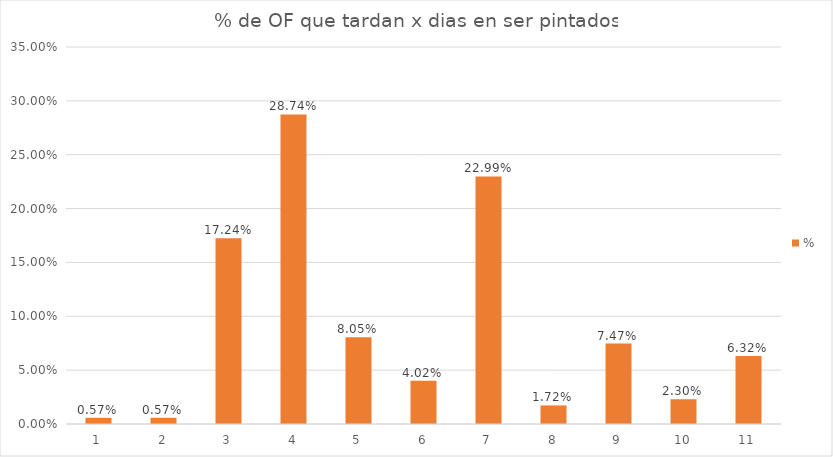
| Category | % |
|---|---|
| 0 | 0.006 |
| 1 | 0.006 |
| 2 | 0.172 |
| 3 | 0.287 |
| 4 | 0.08 |
| 5 | 0.04 |
| 6 | 0.23 |
| 7 | 0.017 |
| 8 | 0.075 |
| 9 | 0.023 |
| 10 | 0.063 |